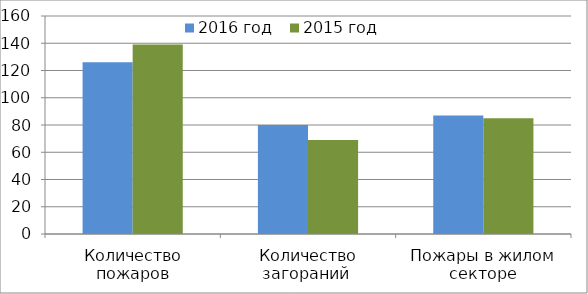
| Category | 2016 год | 2015 год |
|---|---|---|
| Количество пожаров | 126 | 139 |
| Количество загораний  | 80 | 69 |
| Пожары в жилом секторе | 87 | 85 |